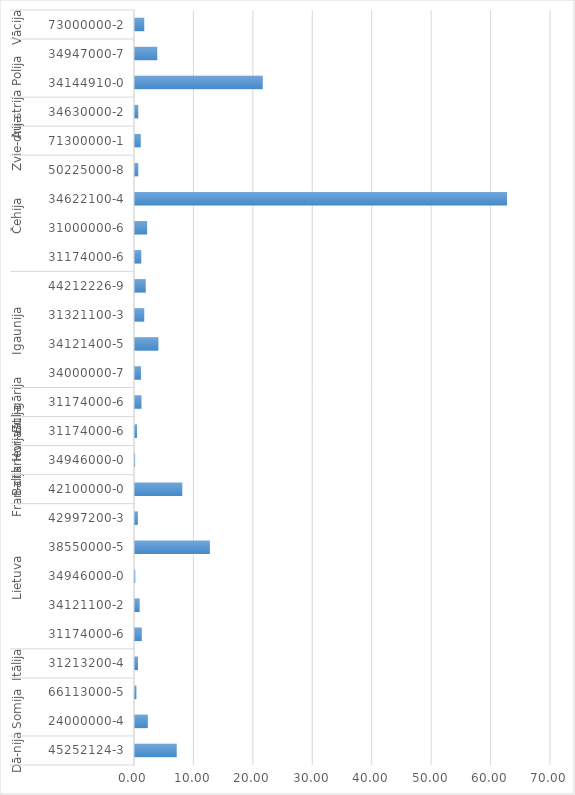
| Category | Series 0 |
|---|---|
| 0 | 7.02 |
| 1 | 2.16 |
| 2 | 0.24 |
| 3 | 0.5 |
| 4 | 1.14 |
| 5 | 0.78 |
| 6 | 0.05 |
| 7 | 12.6 |
| 8 | 0.48 |
| 9 | 7.96 |
| 10 | 0.02 |
| 11 | 0.34 |
| 12 | 1.09 |
| 13 | 1 |
| 14 | 3.94 |
| 15 | 1.56 |
| 16 | 1.81 |
| 17 | 1.06 |
| 18 | 2.04 |
| 19 | 62.6 |
| 20 | 0.55 |
| 21 | 0.97 |
| 22 | 0.55 |
| 23 | 21.5 |
| 24 | 3.75 |
| 25 | 1.56 |